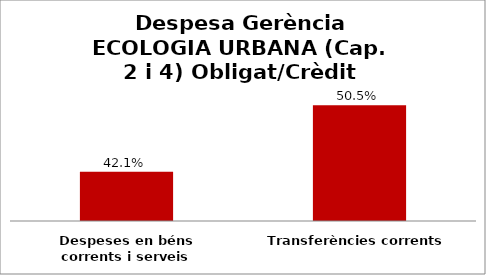
| Category | Series 0 |
|---|---|
| Despeses en béns corrents i serveis | 0.421 |
| Transferències corrents | 0.505 |